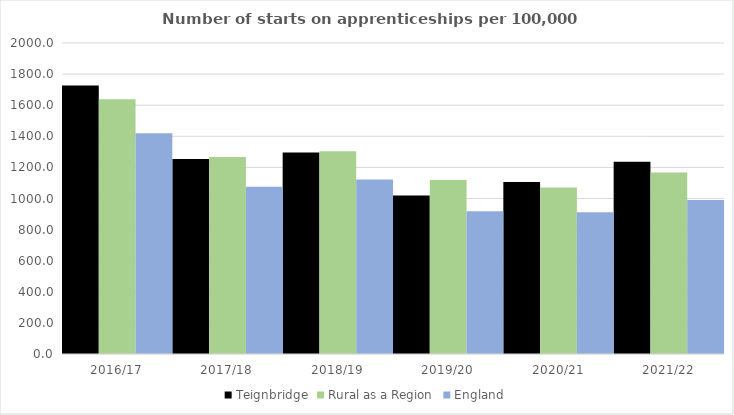
| Category | Teignbridge | Rural as a Region | England |
|---|---|---|---|
| 2016/17 | 1727 | 1638.789 | 1420 |
| 2017/18 | 1254 | 1267.474 | 1075 |
| 2018/19 | 1296 | 1304.57 | 1122 |
| 2019/20 | 1020 | 1119.662 | 918 |
| 2020/21 | 1106 | 1070.748 | 912 |
| 2021/22 | 1236 | 1167.68 | 991 |